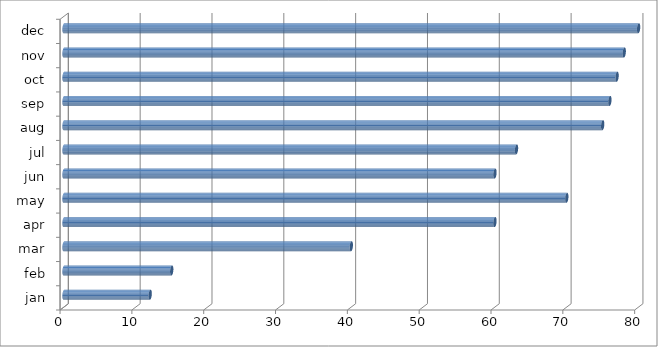
| Category | Series 0 |
|---|---|
| jan | 12 |
| feb | 15 |
| mar | 40 |
| apr | 60 |
| may | 70 |
| jun | 60 |
| jul | 63 |
| aug | 75 |
| sep | 76 |
| oct | 77 |
| nov | 78 |
| dec | 80 |